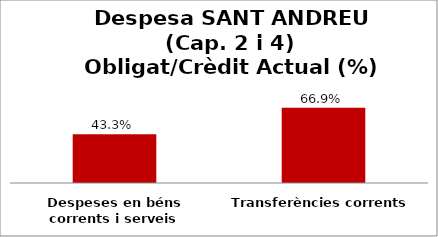
| Category | Series 0 |
|---|---|
| Despeses en béns corrents i serveis | 0.433 |
| Transferències corrents | 0.669 |